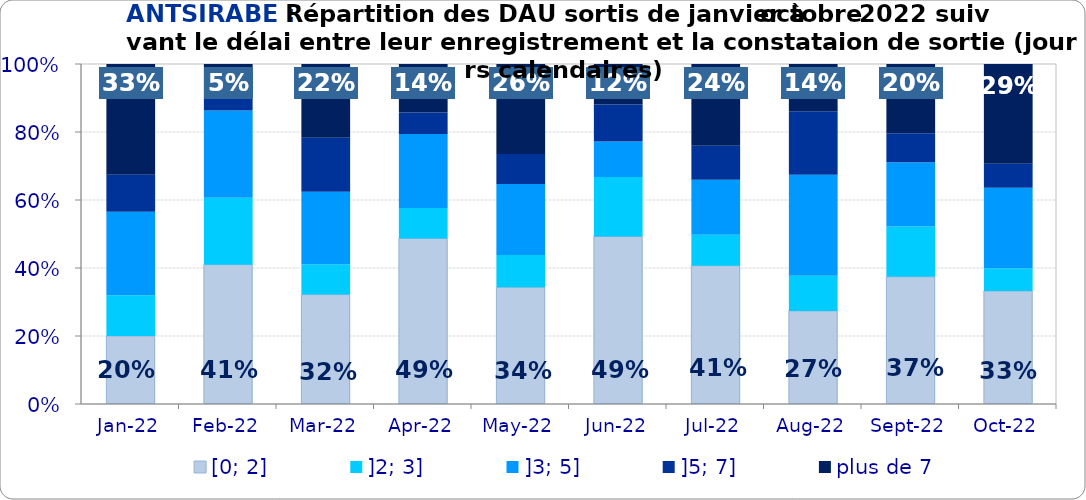
| Category | [0; 2] | ]2; 3] | ]3; 5] | ]5; 7] | plus de 7 |
|---|---|---|---|---|---|
| 2022-01-01 | 0.2 | 0.12 | 0.246 | 0.109 | 0.326 |
| 2022-02-01 | 0.41 | 0.197 | 0.257 | 0.082 | 0.055 |
| 2022-03-01 | 0.322 | 0.089 | 0.213 | 0.159 | 0.217 |
| 2022-04-01 | 0.487 | 0.09 | 0.217 | 0.064 | 0.142 |
| 2022-05-01 | 0.343 | 0.095 | 0.209 | 0.088 | 0.265 |
| 2022-06-01 | 0.493 | 0.175 | 0.104 | 0.108 | 0.119 |
| 2022-07-01 | 0.407 | 0.091 | 0.162 | 0.1 | 0.241 |
| 2022-08-01 | 0.274 | 0.103 | 0.298 | 0.187 | 0.139 |
| 2022-09-01 | 0.374 | 0.148 | 0.189 | 0.085 | 0.204 |
| 2022-10-01 | 0.332 | 0.067 | 0.237 | 0.071 | 0.293 |